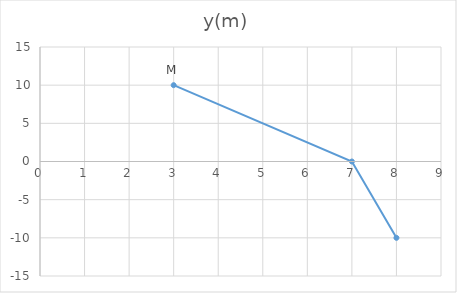
| Category | y(m) |
|---|---|
| 3.0 | 10 |
| 7.0 | 0 |
| 8.0 | -10 |